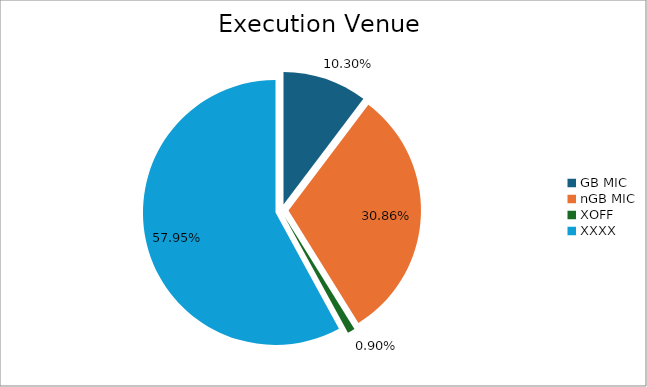
| Category | Series 0 |
|---|---|
| GB MIC | 1131241.317 |
| nGB MIC | 3390330.255 |
| XOFF | 98619.52 |
| XXXX | 6367324.82 |